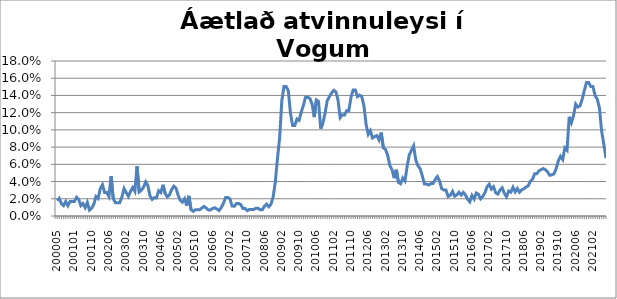
| Category | Series 0 |
|---|---|
| 200005 | 0.018 |
| 200006 | 0.02 |
| 200007 | 0.014 |
| 200008 | 0.012 |
| 200009 | 0.017 |
| 200010 | 0.012 |
| 200011 | 0.017 |
| 200012 | 0.017 |
| 200101 | 0.017 |
| 200102 | 0.022 |
| 200103 | 0.019 |
| 200104 | 0.012 |
| 200105 | 0.014 |
| 200106 | 0.01 |
| 200107 | 0.016 |
| 200109 | 0.007 |
| 200110 | 0.009 |
| 200111 | 0.014 |
| 200112 | 0.023 |
| 200201 | 0.02 |
| 200202 | 0.032 |
| 200203 | 0.036 |
| 200204 | 0.027 |
| 200205 | 0.027 |
| 200206 | 0.023 |
| 200207 | 0.046 |
| 200208 | 0.02 |
| 200209 | 0.015 |
| 200210 | 0.015 |
| 200211 | 0.015 |
| 200212 | 0.022 |
| 200301 | 0.032 |
| 200302 | 0.027 |
| 200303 | 0.023 |
| 200304 | 0.029 |
| 200305 | 0.033 |
| 200306 | 0.029 |
| 200307 | 0.058 |
| 200308 | 0.028 |
| 200309 | 0.03 |
| 200310 | 0.033 |
| 200311 | 0.04 |
| 200312 | 0.035 |
| 200401 | 0.023 |
| 200402 | 0.019 |
| 200403 | 0.021 |
| 200404 | 0.021 |
| 200405 | 0.029 |
| 200406 | 0.027 |
| 200407 | 0.036 |
| 200408 | 0.026 |
| 200409 | 0.022 |
| 200410 | 0.024 |
| 200411 | 0.031 |
| 200412 | 0.035 |
| 200501 | 0.032 |
| 200502 | 0.024 |
| 200503 | 0.018 |
| 200504 | 0.016 |
| 200505 | 0.02 |
| 200506 | 0.012 |
| 200507 | 0.023 |
| 200508 | 0.007 |
| 200509 | 0.005 |
| 200510 | 0.007 |
| 200511 | 0.007 |
| 200512 | 0.007 |
| 200601 | 0.009 |
| 200602 | 0.011 |
| 200603 | 0.009 |
| 200604 | 0.007 |
| 200605 | 0.007 |
| 200606 | 0.009 |
| 200607 | 0.01 |
| 200608 | 0.008 |
| 200609 | 0.006 |
| 200610 | 0.01 |
| 200611 | 0.015 |
| 200612 | 0.021 |
| 200701 | 0.022 |
| 200702 | 0.02 |
| 200703 | 0.012 |
| 200704 | 0.011 |
| 200705 | 0.014 |
| 200706 | 0.014 |
| 200707 | 0.013 |
| 200708 | 0.009 |
| 200709 | 0.009 |
| 200710 | 0.006 |
| 200711 | 0.008 |
| 200712 | 0.008 |
| 200801 | 0.008 |
| 200802 | 0.009 |
| 200803 | 0.009 |
| 200804 | 0.007 |
| 200805 | 0.007 |
| 200806 | 0.012 |
| 200807 | 0.014 |
| 200808 | 0.011 |
| 200809 | 0.014 |
| 200810 | 0.022 |
| 200811 | 0.04 |
| 200812 | 0.067 |
| 200901 | 0.091 |
| 200902 | 0.134 |
| 200903 | 0.15 |
| 200904 | 0.15 |
| 200905 | 0.146 |
| 200906 | 0.12 |
| 200907 | 0.105 |
| 200908 | 0.105 |
| 200909 | 0.113 |
| 200910 | 0.111 |
| 200911 | 0.121 |
| 200912 | 0.129 |
| 201001 | 0.138 |
| 201002 | 0.138 |
| 201003 | 0.136 |
| 201004 | 0.13 |
| 201005 | 0.115 |
| 201006 | 0.135 |
| 201007 | 0.133 |
| 201008 | 0.101 |
| 201009 | 0.108 |
| 201010 | 0.119 |
| 201011 | 0.134 |
| 201012 | 0.138 |
| 201101 | 0.143 |
| 201102 | 0.146 |
| 201103 | 0.144 |
| 201104 | 0.135 |
| 201105 | 0.114 |
| 201106 | 0.117 |
| 201107 | 0.117 |
| 201108 | 0.122 |
| 201109 | 0.122 |
| 201110 | 0.138 |
| 201111 | 0.146 |
| 201112 | 0.146 |
| 201201 | 0.139 |
| 201202 | 0.14 |
| 201203 | 0.139 |
| 201204 | 0.128 |
| 201205 | 0.106 |
| 201206 | 0.095 |
| 201207 | 0.099 |
| 201208 | 0.091 |
| 201209 | 0.092 |
| 201210 | 0.093 |
| 201211 | 0.088 |
| 201212 | 0.097 |
| 201301 | 0.079 |
| 201302 | 0.077 |
| 201303 | 0.07 |
| 201304 | 0.059 |
| 201305 | 0.054 |
| 201306 | 0.044 |
| 201307 | 0.054 |
| 201308 | 0.039 |
| 201309 | 0.037 |
| 201310 | 0.044 |
| 201311 | 0.041 |
| 201312 | 0.058 |
| 201401 | 0.071 |
| 201402 | 0.076 |
| 201403 | 0.081 |
| 201404 | 0.065 |
| 201405 | 0.058 |
| 201406 | 0.055 |
| 201407 | 0.047 |
| 201408 | 0.037 |
| 201409 | 0.037 |
| 201410 | 0.036 |
| 201411 | 0.038 |
| 201412 | 0.038 |
| 201501 | 0.042 |
| 201502 | 0.046 |
| 201503 | 0.041 |
| 201504 | 0.032 |
| 201505 | 0.03 |
| 201506 | 0.03 |
| 201507 | 0.023 |
| 201508 | 0.024 |
| 201509 | 0.029 |
| 201510 | 0.023 |
| 201511 | 0.025 |
| 201512 | 0.028 |
| 201601 | 0.024 |
| 201602 | 0.027 |
| 201603 | 0.024 |
| 201604 | 0.019 |
| 201605 | 0.016 |
| 201606 | 0.024 |
| 201607 | 0.02 |
| 201608 | 0.027 |
| 201609 | 0.025 |
| 201610 | 0.02 |
| 201611 | 0.023 |
| 201612 | 0.027 |
| 201701 | 0.034 |
| 201702 | 0.037 |
| 201703 | 0.031 |
| 201704 | 0.034 |
| 201705 | 0.027 |
| 201706 | 0.025 |
| 201707 | 0.03 |
| 201708 | 0.033 |
| 201709 | 0.026 |
| 201710 | 0.022 |
| 201711 | 0.029 |
| 201712 | 0.028 |
| 201801 | 0.033 |
| 201802 | 0.028 |
| 201803 | 0.032 |
| 201804 | 0.028 |
| 201805 | 0.03 |
| 201806 | 0.032 |
| 201807 | 0.034 |
| 201808 | 0.035 |
| 201809 | 0.04 |
| 201810 | 0.043 |
| 201811 | 0.049 |
| 201812 | 0.049 |
| 201901 | 0.052 |
| 201902 | 0.054 |
| 201903 | 0.055 |
| 201904 | 0.054 |
| 201905 | 0.051 |
| 201906 | 0.047 |
| 201907 | 0.048 |
| 201908 | 0.049 |
| 201909 | 0.055 |
| 201910 | 0.064 |
| 201911 | 0.069 |
| 201912 | 0.065 |
| 202001 | 0.079 |
| 202002 | 0.076 |
| 202003 | 0.115 |
| 202004 | 0.108 |
| 202005 | 0.116 |
| 202006 | 0.13 |
| 202007 | 0.127 |
| 202008 | 0.128 |
| 202009 | 0.136 |
| 202010 | 0.146 |
| 202011 | 0.155 |
| 202012 | 0.155 |
| 202101 | 0.15 |
| 202102 | 0.15 |
| 202103 | 0.14 |
| 202104 | 0.136 |
| 202105 | 0.125 |
| 202106 | 0.099 |
| 202107 | 0.084 |
| 202108 | 0.067 |